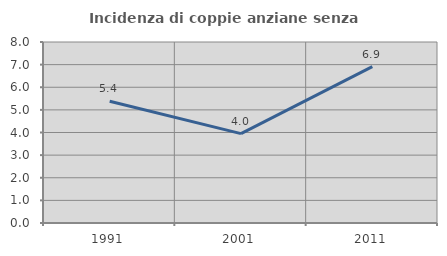
| Category | Incidenza di coppie anziane senza figli  |
|---|---|
| 1991.0 | 5.385 |
| 2001.0 | 3.951 |
| 2011.0 | 6.909 |